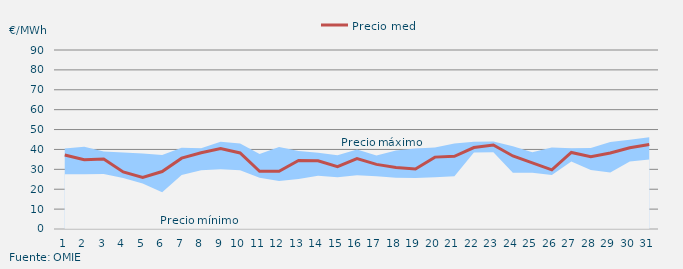
| Category | Precio medio |
|---|---|
| 1 | 37.188 |
| 2 | 34.847 |
| 3 | 35.184 |
| 4 | 28.698 |
| 5 | 25.932 |
| 6 | 28.891 |
| 7 | 35.627 |
| 8 | 38.33 |
| 9 | 40.509 |
| 10 | 38.229 |
| 11 | 29.012 |
| 12 | 29.056 |
| 13 | 34.441 |
| 14 | 34.265 |
| 15 | 31.337 |
| 16 | 35.395 |
| 17 | 32.489 |
| 18 | 30.901 |
| 19 | 30.174 |
| 20 | 36.139 |
| 21 | 36.568 |
| 22 | 40.942 |
| 23 | 42.229 |
| 24 | 36.71 |
| 25 | 33.275 |
| 26 | 29.767 |
| 27 | 38.488 |
| 28 | 36.334 |
| 29 | 38.206 |
| 30 | 40.825 |
| 31 | 42.509 |